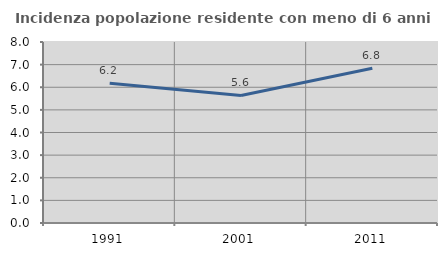
| Category | Incidenza popolazione residente con meno di 6 anni |
|---|---|
| 1991.0 | 6.18 |
| 2001.0 | 5.636 |
| 2011.0 | 6.843 |